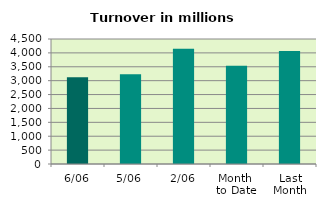
| Category | Series 0 |
|---|---|
| 6/06 | 3123.989 |
| 5/06 | 3232.824 |
| 2/06 | 4152.562 |
| Month 
to Date | 3533.301 |
| Last
Month | 4067.502 |